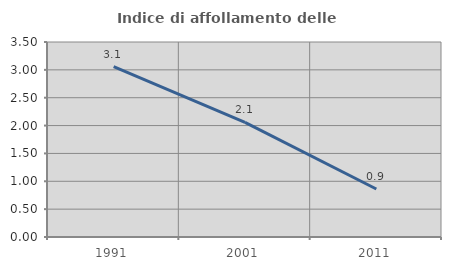
| Category | Indice di affollamento delle abitazioni  |
|---|---|
| 1991.0 | 3.059 |
| 2001.0 | 2.058 |
| 2011.0 | 0.862 |